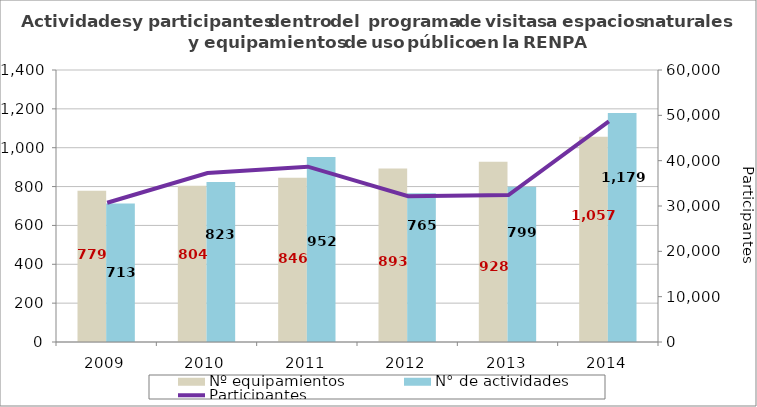
| Category | Nº equipamientos | N° de actividades  |
|---|---|---|
| 2009.0 | 779 | 713 |
| 2010.0 | 804 | 823 |
| 2011.0 | 846 | 952 |
| 2012.0 | 893 | 765 |
| 2013.0 | 928 | 799 |
| 2014.0 | 1057 | 1179 |